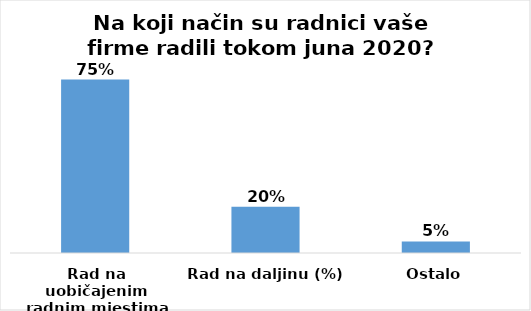
| Category | Series 0 |
|---|---|
| Rad na uobičajenim radnim mjestima (%) | 0.75 |
| Rad na daljinu (%) | 0.2 |
| Ostalo | 0.05 |